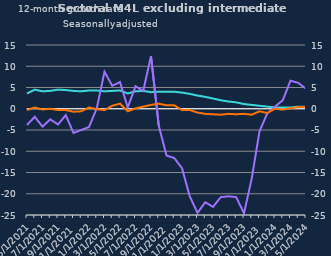
| Category | zero | Households | Non-intermediate OFCs |
|---|---|---|---|
| May-2021 | 0 | 3.6 | -3.8 |
| Jun-2021 | 0 | 4.5 | -1.9 |
| Jul-2021 | 0 | 4.1 | -4.2 |
| Aug-2021 | 0 | 4.2 | -2.5 |
| Sep-2021 | 0 | 4.5 | -3.7 |
| Oct-2021 | 0 | 4.4 | -1.5 |
| Nov-2021 | 0 | 4.2 | -5.7 |
| Dec-2021 | 0 | 4.1 | -5 |
| Jan-2022 | 0 | 4.3 | -4.3 |
| Feb-2022 | 0 | 4.3 | 0.1 |
| Mar-2022 | 0 | 4.1 | 8.7 |
| Apr-2022 | 0 | 4.2 | 5.4 |
| May-2022 | 0 | 4.3 | 6.3 |
| Jun-2022 | 0 | 3.6 | 0.3 |
| Jul-2022 | 0 | 4.1 | 5.3 |
| Aug-2022 | 0 | 4.2 | 4.2 |
| Sep-2022 | 0 | 3.9 | 12.4 |
| Oct-2022 | 0 | 4 | -4 |
| Nov-2022 | 0 | 4 | -11 |
| Dec-2022 | 0 | 4 | -11.6 |
| Jan-2023 | 0 | 3.8 | -14 |
| Feb-2023 | 0 | 3.5 | -20.6 |
| Mar-2023 | 0 | 3.1 | -24.5 |
| Apr-2023 | 0 | 2.8 | -22 |
| May-2023 | 0 | 2.4 | -23.1 |
| Jun-2023 | 0 | 2 | -20.8 |
| Jul-2023 | 0 | 1.7 | -20.6 |
| Aug-2023 | 0 | 1.5 | -20.8 |
| Sep-2023 | 0 | 1.1 | -24.6 |
| Oct-2023 | 0 | 0.9 | -16.4 |
| Nov-2023 | 0 | 0.7 | -5.3 |
| Dec-2023 | 0 | 0.5 | -1.1 |
| Jan-2024 | 0 | 0.3 | 0.5 |
| Feb-2024 | 0 | 0.3 | 2 |
| Mar-2024 | 0 | 0.3 | 6.6 |
| Apr-2024 | 0 | 0.5 | 6.1 |
| May-2024 | 0 | 0.5 | 4.7 |